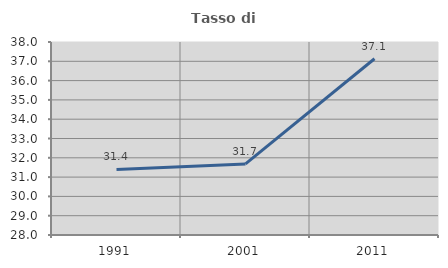
| Category | Tasso di occupazione   |
|---|---|
| 1991.0 | 31.397 |
| 2001.0 | 31.683 |
| 2011.0 | 37.134 |